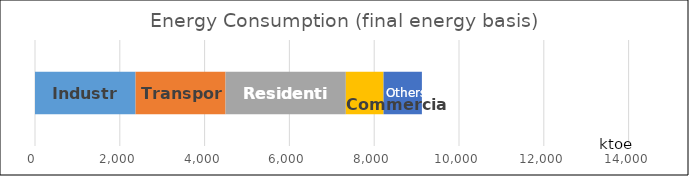
| Category | Industry | Transport | Residential | Commercial | Others |
|---|---|---|---|---|---|
| 0 | 2372 | 2122 | 2837 | 889 | 905 |